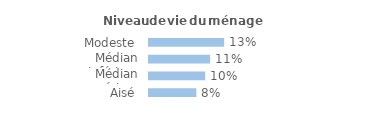
| Category | Series 0 |
|---|---|
| Modeste | 0.132 |
| Médian inférieur | 0.107 |
| Médian supérieur | 0.099 |
| Aisé | 0.083 |